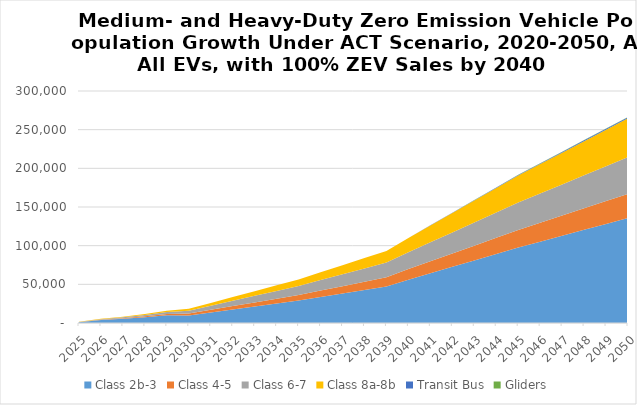
| Category | Class 2b-3 | Class 4-5 | Class 6-7 | Class 8a-8b | Transit Bus | Gliders |
|---|---|---|---|---|---|---|
| 2025.0 | 914.401 | 204.676 | 302.151 | 203.847 | 0 | 0 |
| 2026.0 | 3853.592 | 441.402 | 664.039 | 434.74 | 0 | 0 |
| 2027.0 | 5570.111 | 728.592 | 1116.382 | 707.899 | 0 | 0 |
| 2028.0 | 7596.965 | 1119.256 | 1745.84 | 1048.921 | 0 | 0 |
| 2029.0 | 9984.133 | 1637.744 | 2599.294 | 1476.741 | 0 | 0 |
| 2030.0 | 9857.847 | 2343.121 | 3782.126 | 2370.819 | 0 | 0 |
| 2031.0 | 13694.286 | 3323.821 | 5351.877 | 3570.766 | 0 | 0 |
| 2032.0 | 17530.725 | 4304.521 | 6921.628 | 4770.713 | 0 | 0 |
| 2033.0 | 21367.163 | 5285.22 | 8491.378 | 5970.66 | 0 | 0 |
| 2034.0 | 25203.602 | 6265.92 | 10061.129 | 7170.606 | 0 | 0 |
| 2035.0 | 29040.041 | 7246.619 | 11630.88 | 8370.553 | 0 | 0 |
| 2036.0 | 33560.28 | 8421.005 | 13495.022 | 10024.99 | 0 | 0 |
| 2037.0 | 38080.519 | 9595.392 | 15359.164 | 11679.427 | 0 | 0 |
| 2038.0 | 42600.758 | 10769.778 | 17223.306 | 13333.864 | 0 | 0 |
| 2039.0 | 47120.997 | 11944.164 | 19087.448 | 14988.301 | 0 | 0 |
| 2040.0 | 56018.067 | 13652.483 | 21807.331 | 18402.946 | 115.057 | 44.267 |
| 2041.0 | 64324.161 | 15471.599 | 24522.53 | 21730.797 | 234.66 | 87.571 |
| 2042.0 | 72630.255 | 17290.714 | 27237.729 | 25058.648 | 354.263 | 130.876 |
| 2043.0 | 80936.349 | 19109.829 | 29952.928 | 28386.499 | 473.865 | 174.181 |
| 2044.0 | 89242.443 | 20928.945 | 32668.127 | 31714.35 | 593.468 | 217.486 |
| 2045.0 | 97548.538 | 22748.06 | 35383.326 | 35042.201 | 713.07 | 260.79 |
| 2046.0 | 105187.636 | 24440.026 | 37811.986 | 38065.571 | 839.957 | 302.273 |
| 2047.0 | 112826.735 | 26131.992 | 40240.646 | 41088.942 | 966.844 | 343.755 |
| 2048.0 | 120465.834 | 27823.959 | 42669.306 | 44112.312 | 1093.73 | 385.238 |
| 2049.0 | 128104.932 | 29515.925 | 45097.966 | 47135.682 | 1220.617 | 426.72 |
| 2050.0 | 135744.031 | 31207.891 | 47526.626 | 50159.052 | 1347.504 | 468.203 |